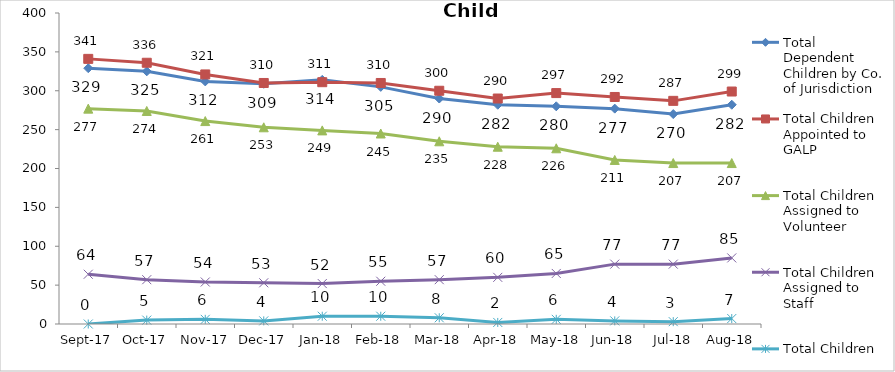
| Category | Total Dependent Children by Co. of Jurisdiction | Total Children Appointed to GALP | Total Children Assigned to Volunteer | Total Children Assigned to Staff | Total Children Unassigned |
|---|---|---|---|---|---|
| 2017-09-01 | 329 | 341 | 277 | 64 | 0 |
| 2017-10-01 | 325 | 336 | 274 | 57 | 5 |
| 2017-11-01 | 312 | 321 | 261 | 54 | 6 |
| 2017-12-01 | 309 | 310 | 253 | 53 | 4 |
| 2018-01-01 | 314 | 311 | 249 | 52 | 10 |
| 2018-02-01 | 305 | 310 | 245 | 55 | 10 |
| 2018-03-01 | 290 | 300 | 235 | 57 | 8 |
| 2018-04-01 | 282 | 290 | 228 | 60 | 2 |
| 2018-05-01 | 280 | 297 | 226 | 65 | 6 |
| 2018-06-01 | 277 | 292 | 211 | 77 | 4 |
| 2018-07-01 | 270 | 287 | 207 | 77 | 3 |
| 2018-08-01 | 282 | 299 | 207 | 85 | 7 |